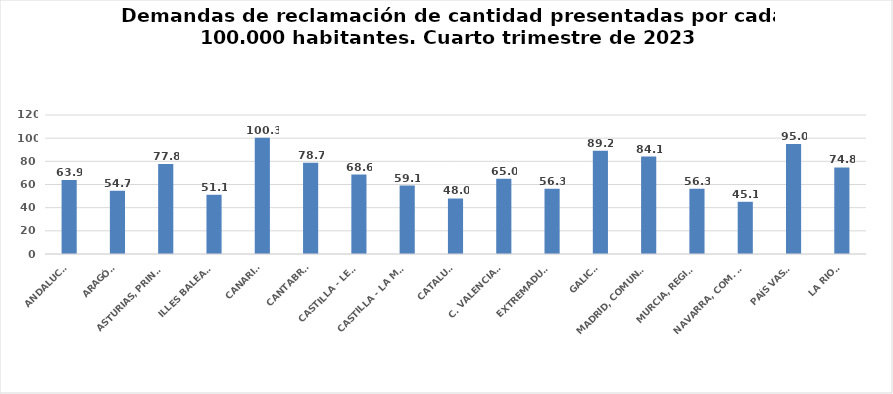
| Category | Series 0 |
|---|---|
| ANDALUCÍA | 63.864 |
| ARAGÓN | 54.694 |
| ASTURIAS, PRINCIPADO | 77.786 |
| ILLES BALEARS | 51.13 |
| CANARIAS | 100.321 |
| CANTABRIA | 78.671 |
| CASTILLA - LEÓN | 68.582 |
| CASTILLA - LA MANCHA | 59.117 |
| CATALUÑA | 48.006 |
| C. VALENCIANA | 64.964 |
| EXTREMADURA | 56.34 |
| GALICIA | 89.232 |
| MADRID, COMUNIDAD | 84.115 |
| MURCIA, REGIÓN | 56.29 |
| NAVARRA, COM. FORAL | 45.076 |
| PAÍS VASCO | 94.959 |
| LA RIOJA | 74.784 |